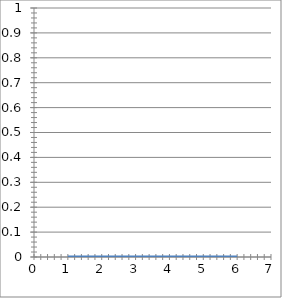
| Category | Series 0 |
|---|---|
| 0 | 0 |
| 1 | 0 |
| 2 | 0 |
| 3 | 0 |
| 4 | 0 |
| 5 | 0 |